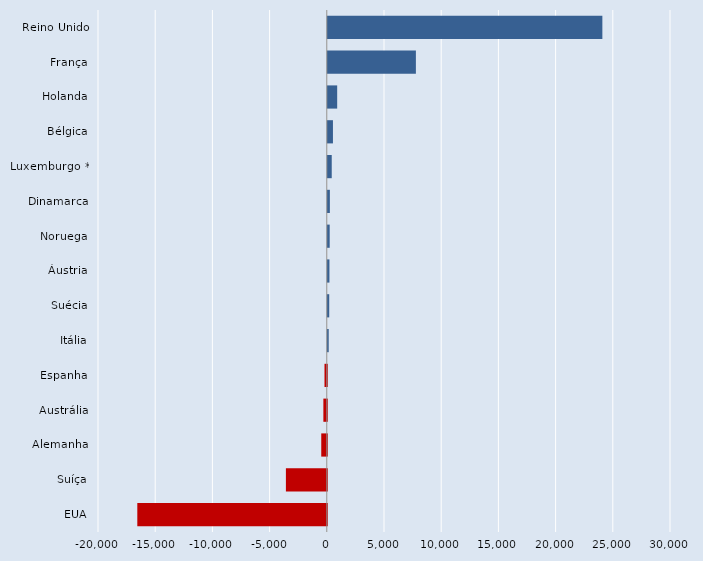
| Category | Series 0 |
|---|---|
| EUA | -16564 |
| Suíça | -3575 |
| Alemanha | -485 |
| Austrália | -300 |
| Espanha | -201 |
| Itália | 80 |
| Suécia | 125 |
| Áustria | 143 |
| Noruega | 165 |
| Dinamarca | 180 |
| Luxemburgo * | 344 |
| Bélgica | 450 |
| Holanda | 820 |
| França | 7700 |
| Reino Unido | 24000 |